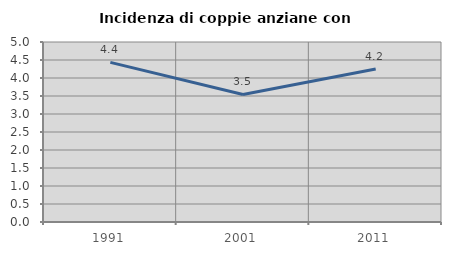
| Category | Incidenza di coppie anziane con figli |
|---|---|
| 1991.0 | 4.433 |
| 2001.0 | 3.543 |
| 2011.0 | 4.248 |